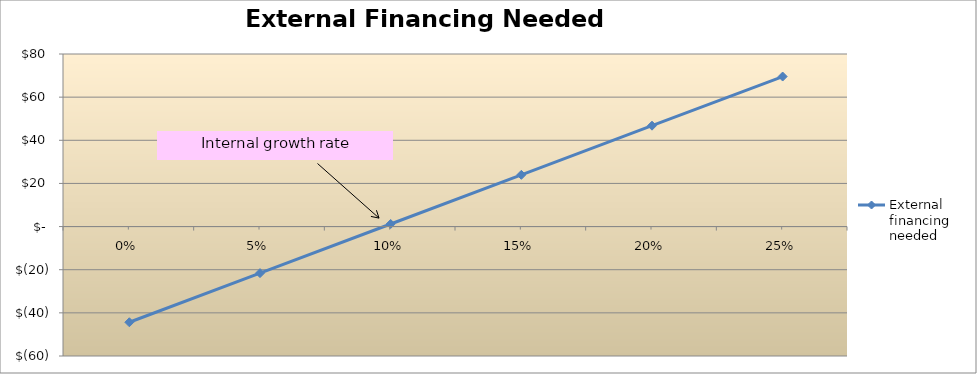
| Category | External
financing
needed
(EFN) |
|---|---|
| 0.0 | -44.36 |
| 0.05 | -21.578 |
| 0.1 | 1.204 |
| 0.15 | 23.986 |
| 0.2 | 46.768 |
| 0.25 | 69.55 |